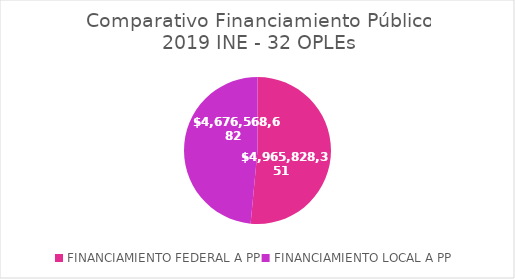
| Category | Series 0 |
|---|---|
| FINANCIAMIENTO FEDERAL A PP | 4965828351 |
| FINANCIAMIENTO LOCAL A PP  | 4676568681.97 |